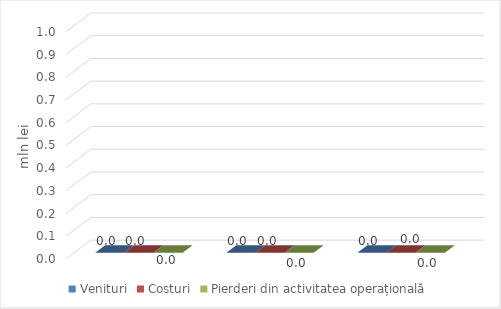
| Category | Venituri | Costuri | Pierderi din activitatea operațională |
|---|---|---|---|
|  | 0 | 0 | 0 |
|  | 0 | 0 | 0 |
|  | 0 | 0 | 0 |